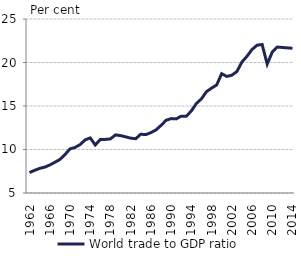
| Category | World trade to GDP ratio |
|---|---|
| 1962.0 | 7.35 |
| 1963.0 | 7.605 |
| 1964.0 | 7.829 |
| 1965.0 | 7.972 |
| 1966.0 | 8.215 |
| 1967.0 | 8.529 |
| 1968.0 | 8.854 |
| 1969.0 | 9.405 |
| 1970.0 | 10.071 |
| 1971.0 | 10.231 |
| 1972.0 | 10.564 |
| 1973.0 | 11.105 |
| 1974.0 | 11.333 |
| 1975.0 | 10.524 |
| 1976.0 | 11.147 |
| 1977.0 | 11.16 |
| 1978.0 | 11.219 |
| 1979.0 | 11.681 |
| 1980.0 | 11.597 |
| 1981.0 | 11.457 |
| 1982.0 | 11.306 |
| 1983.0 | 11.24 |
| 1984.0 | 11.761 |
| 1985.0 | 11.71 |
| 1986.0 | 11.941 |
| 1987.0 | 12.249 |
| 1988.0 | 12.765 |
| 1989.0 | 13.358 |
| 1990.0 | 13.552 |
| 1991.0 | 13.519 |
| 1992.0 | 13.835 |
| 1993.0 | 13.828 |
| 1994.0 | 14.428 |
| 1995.0 | 15.291 |
| 1996.0 | 15.829 |
| 1997.0 | 16.654 |
| 1998.0 | 17.059 |
| 1999.0 | 17.412 |
| 2000.0 | 18.713 |
| 2001.0 | 18.401 |
| 2002.0 | 18.536 |
| 2003.0 | 18.958 |
| 2004.0 | 20.049 |
| 2005.0 | 20.713 |
| 2006.0 | 21.493 |
| 2007.0 | 21.99 |
| 2008.0 | 22.072 |
| 2009.0 | 19.812 |
| 2010.0 | 21.196 |
| 2011.0 | 21.773 |
| 2012.0 | 21.728 |
| 2013.0 | 21.681 |
| 2014.0 | 21.639 |